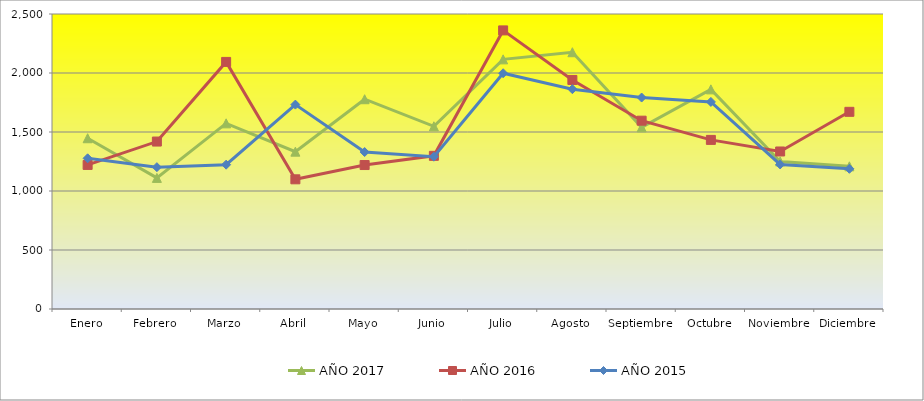
| Category | AÑO 2017 | AÑO 2016 | AÑO 2015 |
|---|---|---|---|
| Enero | 1447.111 | 1221 | 1277 |
| Febrero | 1111.111 | 1419 | 1202 |
| Marzo | 1573.333 | 2094 | 1223 |
| Abril | 1333.333 | 1099 | 1732 |
| Mayo | 1777.778 | 1220 | 1330 |
| Junio | 1548.444 | 1298 | 1291 |
| Julio | 2115.556 | 2361 | 1998 |
| Agosto | 2176 | 1941 | 1863 |
| Septiembre | 1539.556 | 1596 | 1792 |
| Octubre | 1861.277 | 1433 | 1755 |
| Noviembre | 1250.426 | 1335 | 1225 |
| Diciembre | 1208.889 | 1671 | 1188 |